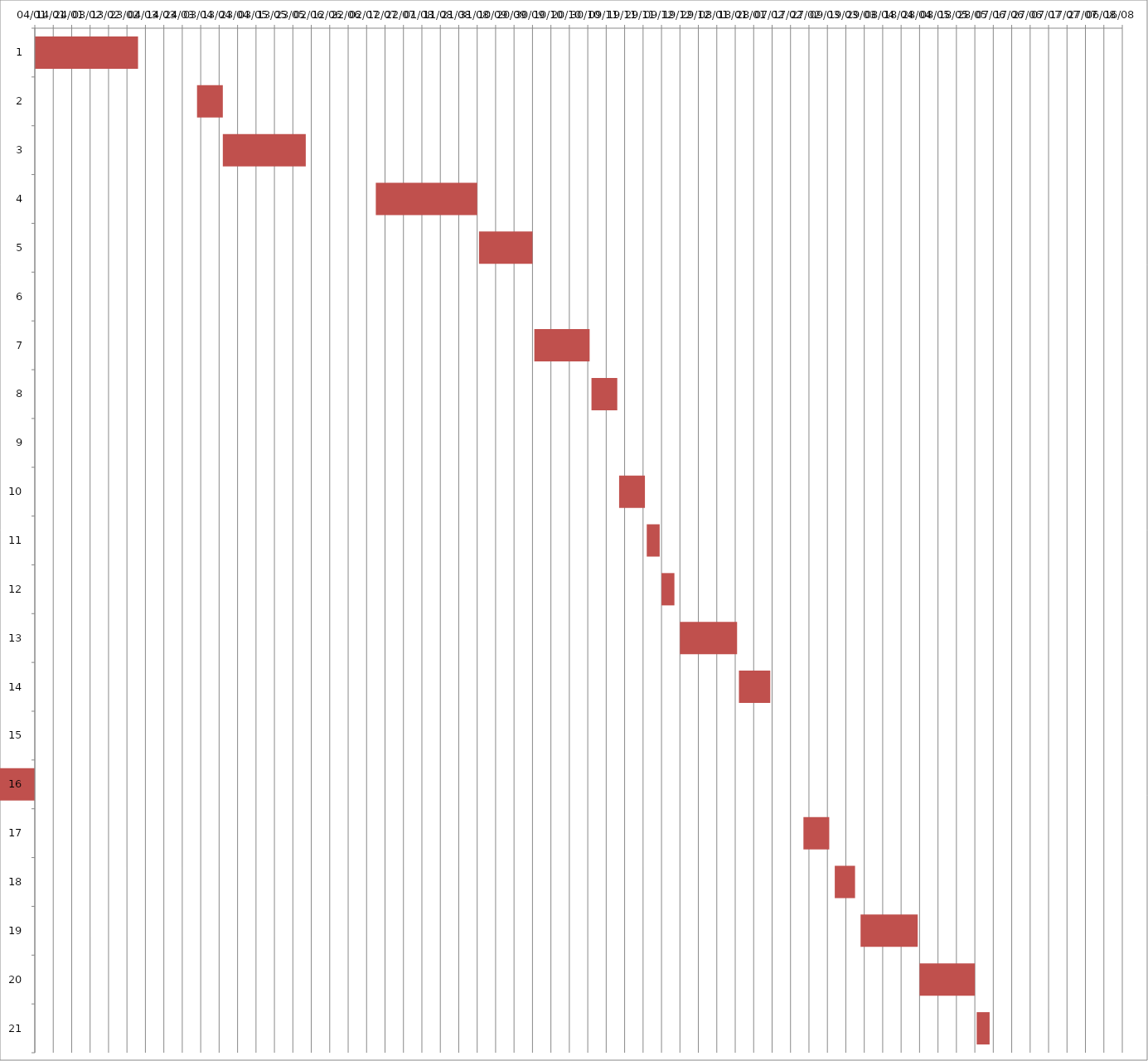
| Category | Fecha de inicio | DURACIÓN |
|---|---|---|
| 0 | 1/4/16 | 56 |
| 1 | 4/1/16 | 14 |
| 2 | 4/15/16 | 45 |
| 3 | 7/7/16 | 55 |
| 4 | 9/1/16 | 29 |
| 5 | 10/1/16 | 0 |
| 6 | 10/1/16 | 30 |
| 7 | 11/1/16 | 14 |
| 8 | 11/16/16 | 0 |
| 9 | 11/16/16 | 14 |
| 10 | 12/1/16 | 7 |
| 11 | 12/9/16 | 7 |
| 12 | 12/19/16 | 31 |
| 13 | 1/20/17 | 17 |
| 14 | 2/8/17 | 0 |
| 15 | 2/9/17 | -352 |
| 16 | 2/24/17 | 14 |
| 17 | 3/13/17 | 11 |
| 18 | 3/27/17 | 31 |
| 19 | 4/28/17 | 30 |
| 20 | 5/29/17 | 7 |